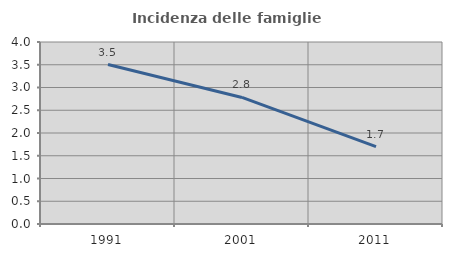
| Category | Incidenza delle famiglie numerose |
|---|---|
| 1991.0 | 3.505 |
| 2001.0 | 2.782 |
| 2011.0 | 1.701 |